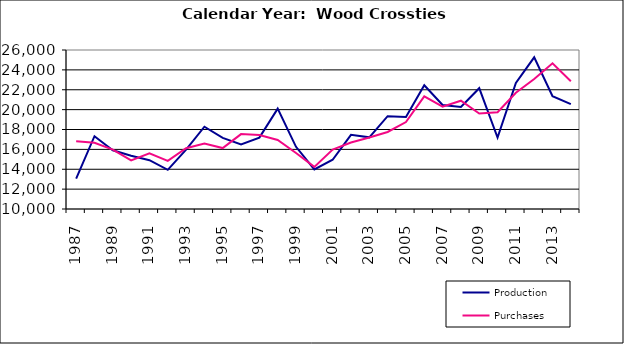
| Category | Production | Purchases |
|---|---|---|
| 1987.0 | 13059 | 16814 |
| 1988.0 | 17325 | 16665 |
| 1989.0 | 15906 | 15972 |
| 1990.0 | 15353 | 14898 |
| 1991.0 | 14910 | 15613 |
| 1992.0 | 13943 | 14841 |
| 1993.0 | 15980 | 16113 |
| 1994.0 | 18280 | 16600 |
| 1995.0 | 17157 | 16131 |
| 1996.0 | 16490 | 17539 |
| 1997.0 | 17188 | 17439 |
| 1998.0 | 20099 | 16950 |
| 1999.0 | 16256 | 15640 |
| 2000.0 | 13983.1 | 14235.1 |
| 2001.0 | 14957 | 15981 |
| 2002.0 | 17467.591 | 16685.945 |
| 2003.0 | 17213.928 | 17193.927 |
| 2004.0 | 19338.37 | 17749.231 |
| 2005.0 | 19260.619 | 18744.891 |
| 2006.0 | 22448.548 | 21332.775 |
| 2007.0 | 20471.092 | 20301.696 |
| 2008.0 | 20258.46 | 20896.232 |
| 2009.0 | 22156.289 | 19604.055 |
| 2010.0 | 17190.1 | 19735.982 |
| 2011.0 | 22689.418 | 21699.581 |
| 2012.0 | 25264.451 | 23081.551 |
| 2013.0 | 21359.765 | 24664.451 |
| 2014.0 | 20549.894 | 22861.557 |